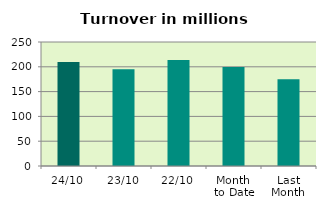
| Category | Series 0 |
|---|---|
| 24/10 | 209.788 |
| 23/10 | 195.122 |
| 22/10 | 213.883 |
| Month 
to Date | 199.454 |
| Last
Month | 174.723 |